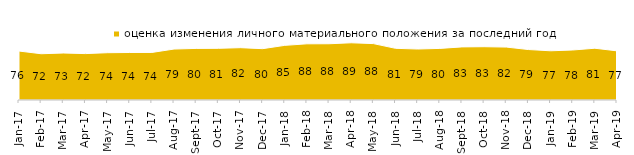
| Category | оценка изменения личного материального положения за последний год |
|---|---|
| 2017-01-01 | 76.3 |
| 2017-02-01 | 72.1 |
| 2017-03-01 | 73.2 |
| 2017-04-01 | 72.3 |
| 2017-05-01 | 73.7 |
| 2017-06-01 | 74.05 |
| 2017-07-01 | 74.1 |
| 2017-08-01 | 79.4 |
| 2017-09-01 | 80.4 |
| 2017-10-01 | 80.55 |
| 2017-11-01 | 81.55 |
| 2017-12-01 | 80 |
| 2018-01-01 | 85.15 |
| 2018-02-01 | 87.55 |
| 2018-03-01 | 87.65 |
| 2018-04-01 | 89.15 |
| 2018-05-01 | 87.9 |
| 2018-06-01 | 80.55 |
| 2018-07-01 | 79.45 |
| 2018-08-01 | 80.4 |
| 2018-09-01 | 82.75 |
| 2018-10-01 | 83.05 |
| 2018-11-01 | 82.485 |
| 2018-12-01 | 78.65 |
| 2019-01-01 | 76.7 |
| 2019-02-01 | 77.9 |
| 2019-03-01 | 80.656 |
| 2019-04-01 | 76.584 |